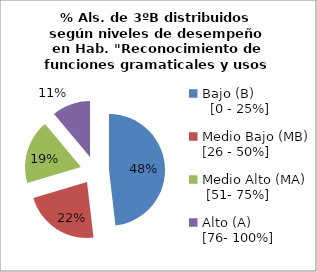
| Category | Series 0 |
|---|---|
| Bajo (B)                 [0 - 25%] | 13 |
| Medio Bajo (MB)  [26 - 50%] | 6 |
| Medio Alto (MA)   [51- 75%] | 5 |
| Alto (A)               [76- 100%] | 3 |